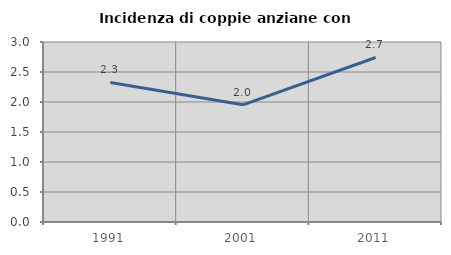
| Category | Incidenza di coppie anziane con figli |
|---|---|
| 1991.0 | 2.326 |
| 2001.0 | 1.953 |
| 2011.0 | 2.742 |